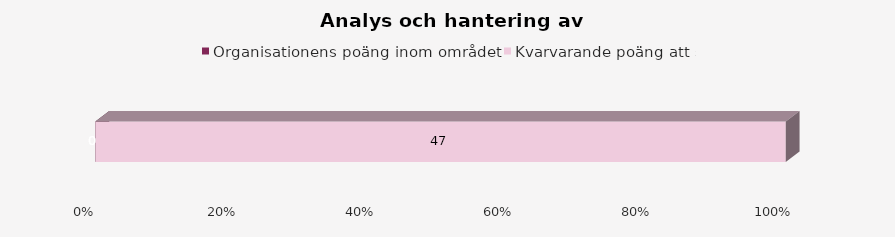
| Category | Organisationens poäng inom området | Kvarvarande poäng att samla |
|---|---|---|
| 0 | 0 | 47 |